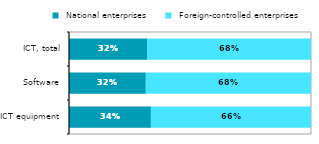
| Category |  National enterprises |  Foreign-controlled enterprises |
|---|---|---|
| ICT equipment | 0.338 | 0.662 |
| Software | 0.317 | 0.683 |
| ICT, total | 0.322 | 0.678 |